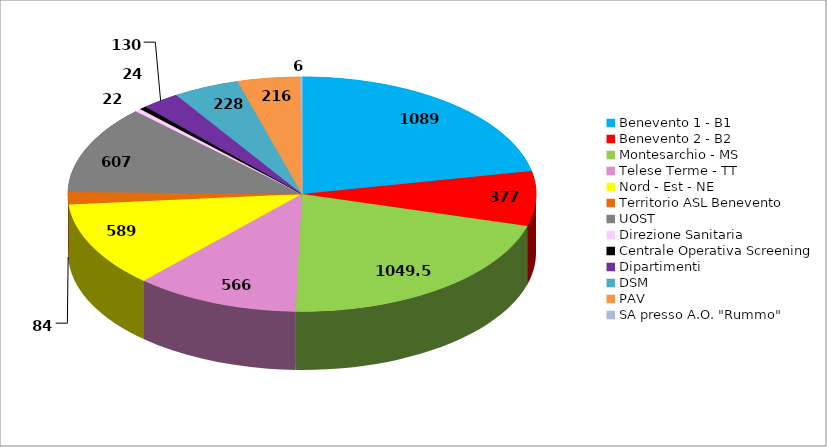
| Category | Series 0 |
|---|---|
| Benevento 1 - B1 | 1089 |
| Benevento 2 - B2 | 377 |
| Montesarchio - MS | 1049.5 |
| Telese Terme - TT | 566 |
| Nord - Est - NE | 589 |
| Territorio ASL Benevento | 84 |
| UOST | 607 |
| Direzione Sanitaria | 22 |
| Centrale Operativa Screening | 24 |
| Dipartimenti | 130 |
| DSM | 228 |
| PAV | 216 |
| SA presso A.O. "Rummo" | 6 |